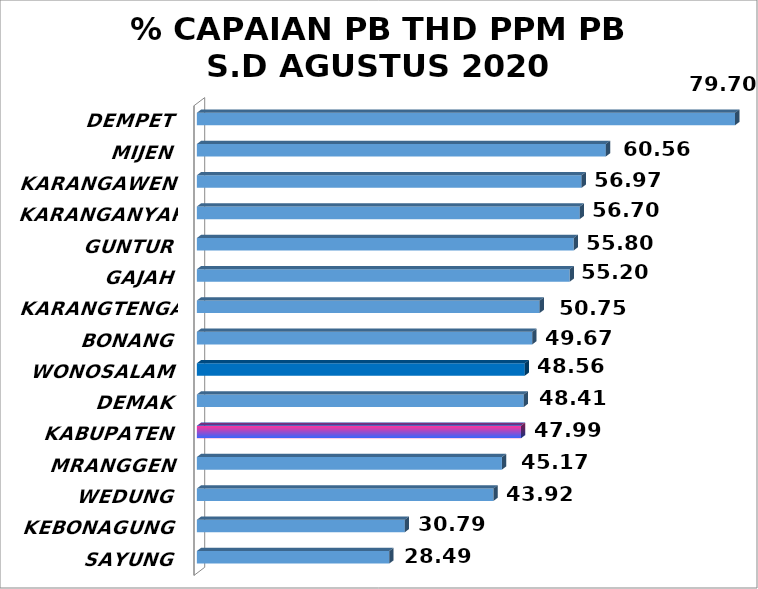
| Category | Series 0 |
|---|---|
| SAYUNG | 28.49 |
| KEBONAGUNG | 30.79 |
| WEDUNG | 43.92 |
| MRANGGEN | 45.17 |
| KABUPATEN | 47.99 |
| DEMAK | 48.41 |
| WONOSALAM | 48.56 |
| BONANG | 49.67 |
| KARANGTENGAH | 50.75 |
| GAJAH | 55.2 |
| GUNTUR | 55.8 |
| KARANGANYAR | 56.7 |
| KARANGAWEN | 56.97 |
| MIJEN | 60.56 |
| DEMPET | 79.7 |